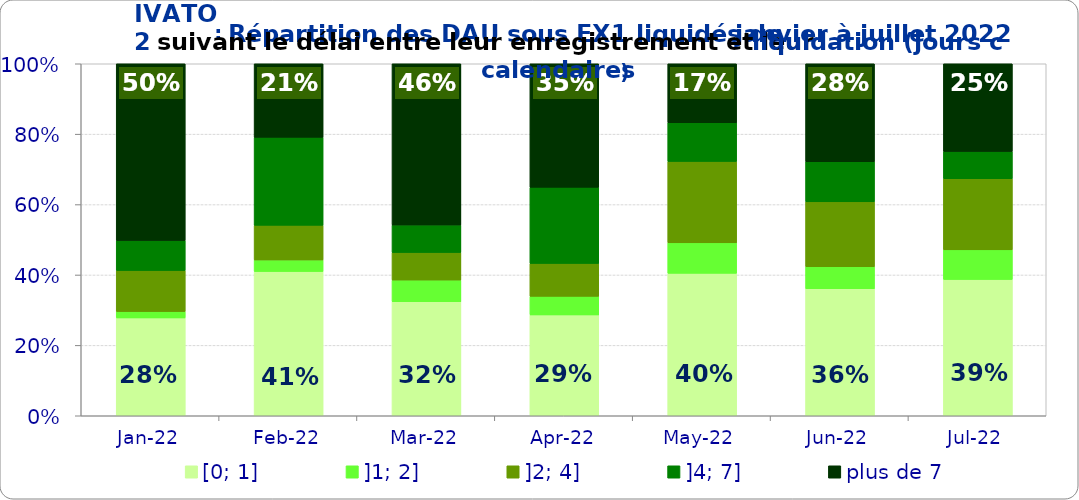
| Category | [0; 1] | ]1; 2] | ]2; 4] | ]4; 7] | plus de 7 |
|---|---|---|---|---|---|
| 2022-01-01 | 0.278 | 0.018 | 0.117 | 0.085 | 0.502 |
| 2022-02-01 | 0.41 | 0.033 | 0.098 | 0.25 | 0.209 |
| 2022-03-01 | 0.324 | 0.061 | 0.078 | 0.078 | 0.458 |
| 2022-04-01 | 0.287 | 0.053 | 0.094 | 0.216 | 0.351 |
| 2022-05-01 | 0.405 | 0.087 | 0.231 | 0.11 | 0.168 |
| 2022-06-01 | 0.361 | 0.063 | 0.184 | 0.114 | 0.278 |
| 2022-07-01 | 0.387 | 0.084 | 0.202 | 0.077 | 0.249 |